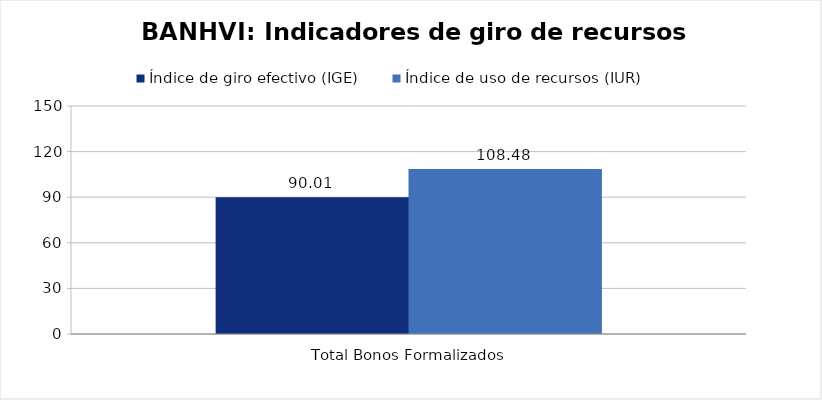
| Category | Índice de giro efectivo (IGE) | Índice de uso de recursos (IUR)  |
|---|---|---|
| Total Bonos Formalizados | 90.01 | 108.478 |